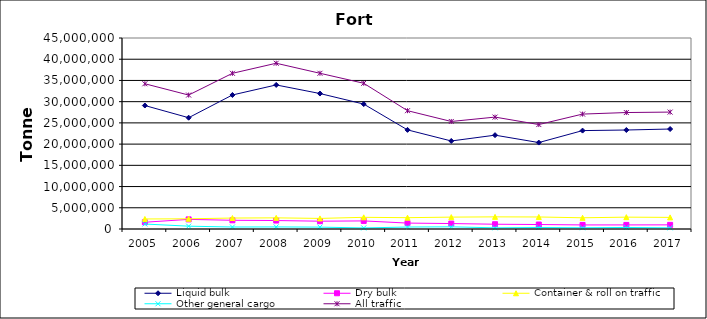
| Category | Liquid bulk | Dry bulk | Container & roll on traffic | Other general cargo | All traffic |
|---|---|---|---|---|---|
| 2005.0 | 29090000 | 1596000 | 2361000 | 1171000 | 34218000 |
| 2006.0 | 26220000 | 2264000 | 2407000 | 663000 | 31556000 |
| 2007.0 | 31578000 | 2051000 | 2582000 | 470000 | 36681000 |
| 2008.0 | 33941000 | 1994000 | 2627000 | 492000 | 39054000 |
| 2009.0 | 31913166 | 1840497 | 2494191 | 442331 | 36690185 |
| 2010.0 | 29432000 | 1904000 | 2751000 | 249000 | 34335000 |
| 2011.0 | 23353000 | 1392000 | 2666000 | 466000 | 27878000 |
| 2012.0 | 20739000 | 1283000 | 2798000 | 512000 | 25332000 |
| 2013.0 | 22109000 | 1125000 | 2858000 | 273000 | 26365000 |
| 2014.0 | 20363000 | 1056000 | 2834000 | 355000 | 24608000 |
| 2015.0 | 23183000 | 958000 | 2643000 | 290000 | 27074000 |
| 2016.0 | 23323000 | 963000 | 2792000 | 361000 | 27439000 |
| 2017.0 | 23556000 | 979000 | 2737000 | 272000 | 27544000 |